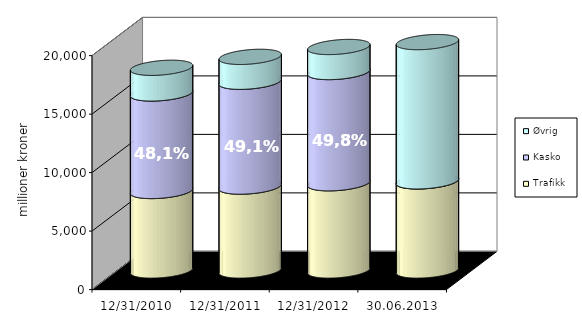
| Category | Trafikk | Kasko | Øvrig |
|---|---|---|---|
| 31.12.2010 | 6795.7 | 8339.721 | 2191.06 |
| 31.12.2011 | 7171.76 | 8962.957 | 2126.121 |
| 31.12.2012 | 7457.552 | 9507.808 | 2139.625 |
| 30.06.2013 | 7620.871 | 0 | 11902.482 |